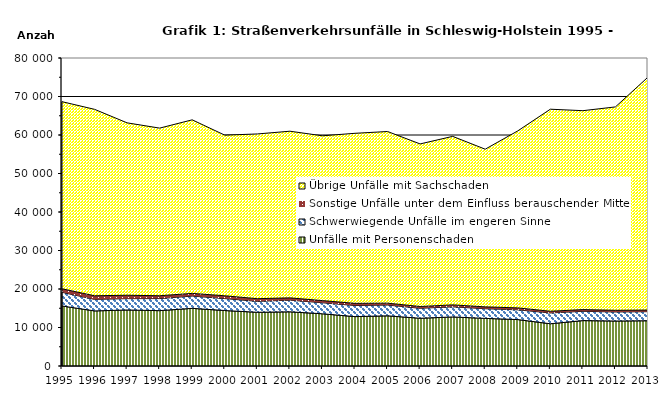
| Category | Unfälle mit Personenschaden | Schwerwiegende Unfälle im engeren Sinne | Sonstige Unfälle unter dem Einfluss berauschender Mittel 1) | Übrige Unfälle mit Sachschaden |
|---|---|---|---|---|
| 1995.0 | 15592 | 3544 | 920 | 48598 |
| 1996.0 | 14307 | 2996 | 937 | 48426 |
| 1997.0 | 14549 | 2947 | 883 | 44777 |
| 1998.0 | 14376 | 3136 | 737 | 43539 |
| 1999.0 | 14979 | 3185 | 696 | 45079 |
| 2000.0 | 14406 | 3105 | 725 | 41724 |
| 2001.0 | 13950 | 2845 | 688 | 42788 |
| 2002.0 | 14072 | 3028 | 595 | 43289 |
| 2003.0 | 13561 | 2866 | 559 | 42806 |
| 2004.0 | 12827 | 2877 | 564 | 44173 |
| 2005.0 | 13033 | 2795 | 499 | 44581 |
| 2006.0 | 12400 | 2588 | 466 | 42228 |
| 2007.0 | 12740 | 2628 | 507 | 43770 |
| 2008.0 | 12369 | 2510 | 481 | 40954 |
| 2009.0 | 12061 | 2528 | 502 | 45976 |
| 2010.0 | 10974 | 2803 | 441 | 52481 |
| 2011.0 | 11793 | 2419 | 443 | 51662 |
| 2012.0 | 11682 | 2353 | 422 | 52839 |
| 2013.0 | 11757 | 2357 | 414 | 60506 |